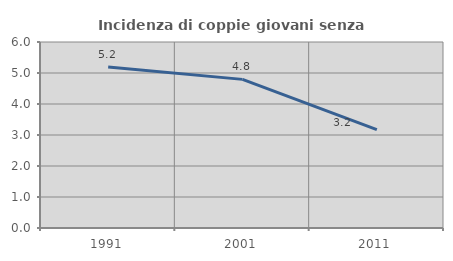
| Category | Incidenza di coppie giovani senza figli |
|---|---|
| 1991.0 | 5.19 |
| 2001.0 | 4.795 |
| 2011.0 | 3.174 |